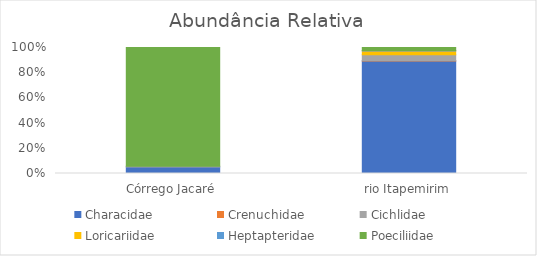
| Category | Characidae | Crenuchidae  | Cichlidae | Loricariidae | Heptapteridae | Poeciliidae |
|---|---|---|---|---|---|---|
| Córrego Jacaré | 5.112 | 0 | 0.613 | 0 | 0 | 94.274 |
| rio Itapemirim | 89.189 | 0.386 | 4.633 | 3.089 | 0.386 | 2.317 |